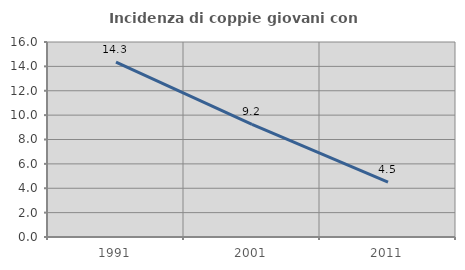
| Category | Incidenza di coppie giovani con figli |
|---|---|
| 1991.0 | 14.349 |
| 2001.0 | 9.234 |
| 2011.0 | 4.511 |